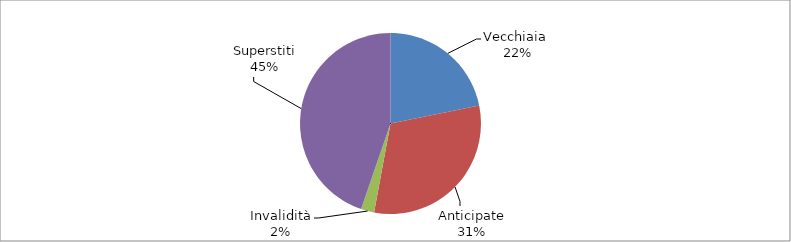
| Category | Series 0 |
|---|---|
| Vecchiaia  | 1852 |
| Anticipate | 2641 |
| Invalidità | 200 |
| Superstiti | 3799 |